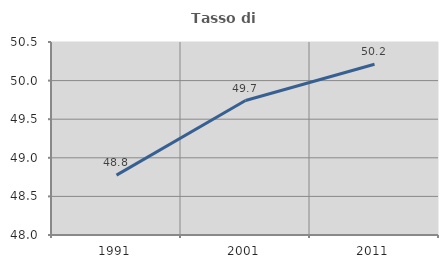
| Category | Tasso di occupazione   |
|---|---|
| 1991.0 | 48.775 |
| 2001.0 | 49.742 |
| 2011.0 | 50.212 |